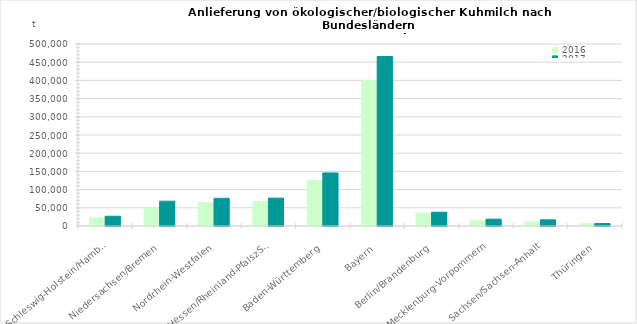
| Category | 2016 | 2017 |
|---|---|---|
| Schleswig-Holstein/Hamburg | 22527.564 | 26671.728 |
| Niedersachsen/Bremen | 48344.929 | 68059.256 |
| Nordrhein-Westfalen | 64381.217 | 76030.132 |
| Hessen/Rheinland-PfalszSaarland | 66944.159 | 76575.012 |
| Baden-Württemberg | 125600.863 | 145768.767 |
| Bayern | 399187.408 | 465692.022 |
| Berlin/Brandenburg | 35254.331 | 37887 |
| Mecklenburg-Vorpommern | 14608.035 | 18754.649 |
| Sachsen/Sachsen-Anhalt | 11405.25 | 16936.528 |
| Thüringen | 6463.834 | 6705.55 |